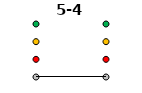
| Category | 0 | 1 | 2 | 3 | 5-4 |
|---|---|---|---|---|---|
| Time 1 | 0 | 1 | 2 | 3 | 0 |
| Time 2 | 0 | 1 | 2 | 3 | 0 |